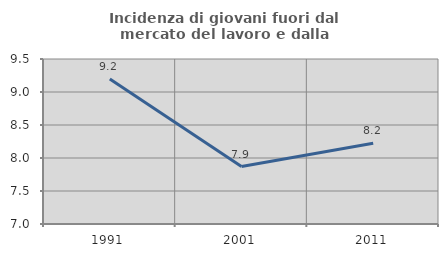
| Category | Incidenza di giovani fuori dal mercato del lavoro e dalla formazione  |
|---|---|
| 1991.0 | 9.195 |
| 2001.0 | 7.871 |
| 2011.0 | 8.223 |